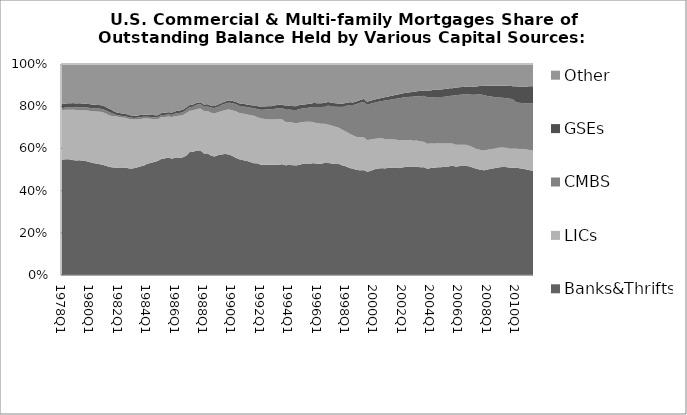
| Category | Banks&Thrifts | LICs | CMBS | GSEs | Other |
|---|---|---|---|---|---|
| 1978Q1 | 0.545 | 0.236 | 0.009 | 0.02 | 0.19 |
| 1978Q2 | 0.549 | 0.235 | 0.011 | 0.019 | 0.187 |
| 1978Q3 | 0.548 | 0.235 | 0.011 | 0.019 | 0.187 |
| 1978Q4 | 0.545 | 0.239 | 0.012 | 0.019 | 0.185 |
| 1979Q1 | 0.543 | 0.239 | 0.013 | 0.019 | 0.187 |
| 1979Q2 | 0.543 | 0.239 | 0.013 | 0.018 | 0.186 |
| 1979Q3 | 0.542 | 0.239 | 0.014 | 0.018 | 0.187 |
| 1979Q4 | 0.539 | 0.241 | 0.014 | 0.018 | 0.189 |
| 1980Q1 | 0.534 | 0.244 | 0.014 | 0.017 | 0.191 |
| 1980Q2 | 0.53 | 0.245 | 0.015 | 0.017 | 0.193 |
| 1980Q3 | 0.527 | 0.247 | 0.015 | 0.017 | 0.194 |
| 1980Q4 | 0.524 | 0.249 | 0.015 | 0.017 | 0.195 |
| 1981Q1 | 0.52 | 0.248 | 0.015 | 0.016 | 0.201 |
| 1981Q2 | 0.514 | 0.246 | 0.015 | 0.016 | 0.21 |
| 1981Q3 | 0.51 | 0.243 | 0.015 | 0.015 | 0.217 |
| 1981Q4 | 0.51 | 0.243 | 0.007 | 0.012 | 0.228 |
| 1982Q1 | 0.507 | 0.242 | 0.007 | 0.012 | 0.232 |
| 1982Q2 | 0.507 | 0.239 | 0.007 | 0.012 | 0.234 |
| 1982Q3 | 0.508 | 0.236 | 0.007 | 0.012 | 0.237 |
| 1982Q4 | 0.505 | 0.234 | 0.007 | 0.011 | 0.242 |
| 1983Q1 | 0.505 | 0.232 | 0.008 | 0.011 | 0.245 |
| 1983Q2 | 0.509 | 0.227 | 0.008 | 0.011 | 0.245 |
| 1983Q3 | 0.514 | 0.225 | 0.009 | 0.01 | 0.242 |
| 1983Q4 | 0.518 | 0.223 | 0.009 | 0.01 | 0.24 |
| 1984Q1 | 0.527 | 0.215 | 0.009 | 0.009 | 0.24 |
| 1984Q2 | 0.531 | 0.209 | 0.008 | 0.01 | 0.241 |
| 1984Q3 | 0.536 | 0.203 | 0.009 | 0.01 | 0.242 |
| 1984Q4 | 0.541 | 0.198 | 0.008 | 0.01 | 0.243 |
| 1985Q1 | 0.55 | 0.198 | 0.01 | 0.01 | 0.232 |
| 1985Q2 | 0.553 | 0.196 | 0.01 | 0.01 | 0.231 |
| 1985Q3 | 0.557 | 0.194 | 0.01 | 0.011 | 0.228 |
| 1985Q4 | 0.551 | 0.197 | 0.01 | 0.011 | 0.23 |
| 1986Q1 | 0.557 | 0.196 | 0.012 | 0.01 | 0.224 |
| 1986Q2 | 0.556 | 0.199 | 0.013 | 0.012 | 0.221 |
| 1986Q3 | 0.557 | 0.2 | 0.014 | 0.012 | 0.217 |
| 1986Q4 | 0.565 | 0.202 | 0.016 | 0.01 | 0.206 |
| 1987Q1 | 0.583 | 0.195 | 0.018 | 0.009 | 0.195 |
| 1987Q2 | 0.584 | 0.196 | 0.019 | 0.009 | 0.191 |
| 1987Q3 | 0.59 | 0.197 | 0.02 | 0.009 | 0.184 |
| 1987Q4 | 0.59 | 0.199 | 0.021 | 0.009 | 0.181 |
| 1988Q1 | 0.576 | 0.201 | 0.022 | 0.009 | 0.192 |
| 1988Q2 | 0.576 | 0.201 | 0.023 | 0.009 | 0.191 |
| 1988Q3 | 0.566 | 0.203 | 0.025 | 0.009 | 0.198 |
| 1988Q4 | 0.561 | 0.204 | 0.026 | 0.009 | 0.199 |
| 1989Q1 | 0.568 | 0.203 | 0.027 | 0.009 | 0.192 |
| 1989Q2 | 0.571 | 0.205 | 0.029 | 0.01 | 0.184 |
| 1989Q3 | 0.574 | 0.208 | 0.031 | 0.01 | 0.177 |
| 1989Q4 | 0.571 | 0.214 | 0.032 | 0.011 | 0.172 |
| 1990Q1 | 0.564 | 0.216 | 0.034 | 0.011 | 0.175 |
| 1990Q2 | 0.555 | 0.22 | 0.034 | 0.011 | 0.18 |
| 1990Q3 | 0.548 | 0.22 | 0.034 | 0.011 | 0.187 |
| 1990Q4 | 0.544 | 0.22 | 0.036 | 0.012 | 0.187 |
| 1991Q1 | 0.541 | 0.221 | 0.035 | 0.012 | 0.192 |
| 1991Q2 | 0.535 | 0.222 | 0.035 | 0.012 | 0.195 |
| 1991Q3 | 0.53 | 0.225 | 0.036 | 0.012 | 0.197 |
| 1991Q4 | 0.529 | 0.219 | 0.039 | 0.013 | 0.2 |
| 1992Q1 | 0.523 | 0.219 | 0.041 | 0.014 | 0.204 |
| 1992Q2 | 0.522 | 0.218 | 0.044 | 0.014 | 0.203 |
| 1992Q3 | 0.522 | 0.216 | 0.047 | 0.014 | 0.2 |
| 1992Q4 | 0.522 | 0.214 | 0.048 | 0.015 | 0.2 |
| 1993Q1 | 0.523 | 0.215 | 0.05 | 0.016 | 0.196 |
| 1993Q2 | 0.523 | 0.216 | 0.053 | 0.016 | 0.193 |
| 1993Q3 | 0.525 | 0.213 | 0.053 | 0.017 | 0.192 |
| 1993Q4 | 0.52 | 0.205 | 0.059 | 0.017 | 0.199 |
| 1994Q1 | 0.521 | 0.204 | 0.059 | 0.018 | 0.198 |
| 1994Q2 | 0.521 | 0.201 | 0.06 | 0.018 | 0.2 |
| 1994Q3 | 0.519 | 0.199 | 0.063 | 0.018 | 0.2 |
| 1994Q4 | 0.523 | 0.199 | 0.065 | 0.019 | 0.194 |
| 1995Q1 | 0.527 | 0.198 | 0.064 | 0.018 | 0.192 |
| 1995Q2 | 0.529 | 0.197 | 0.066 | 0.018 | 0.19 |
| 1995Q3 | 0.528 | 0.198 | 0.068 | 0.018 | 0.188 |
| 1995Q4 | 0.53 | 0.193 | 0.074 | 0.018 | 0.185 |
| 1996Q1 | 0.527 | 0.192 | 0.077 | 0.018 | 0.186 |
| 1996Q2 | 0.527 | 0.189 | 0.079 | 0.018 | 0.186 |
| 1996Q3 | 0.531 | 0.185 | 0.082 | 0.017 | 0.184 |
| 1996Q4 | 0.531 | 0.182 | 0.09 | 0.017 | 0.18 |
| 1997Q1 | 0.528 | 0.179 | 0.092 | 0.016 | 0.184 |
| 1997Q2 | 0.526 | 0.176 | 0.096 | 0.016 | 0.186 |
| 1997Q3 | 0.526 | 0.172 | 0.099 | 0.015 | 0.188 |
| 1997Q4 | 0.519 | 0.168 | 0.11 | 0.014 | 0.188 |
| 1998Q1 | 0.515 | 0.165 | 0.122 | 0.013 | 0.185 |
| 1998Q2 | 0.507 | 0.162 | 0.136 | 0.013 | 0.181 |
| 1998Q3 | 0.504 | 0.158 | 0.143 | 0.013 | 0.182 |
| 1998Q4 | 0.498 | 0.157 | 0.156 | 0.013 | 0.177 |
| 1999Q1 | 0.496 | 0.156 | 0.163 | 0.013 | 0.171 |
| 1999Q2 | 0.497 | 0.156 | 0.167 | 0.014 | 0.165 |
| 1999Q3 | 0.49 | 0.15 | 0.167 | 0.014 | 0.179 |
| 1999Q4 | 0.493 | 0.149 | 0.17 | 0.014 | 0.173 |
| 2000Q1 | 0.501 | 0.144 | 0.171 | 0.015 | 0.169 |
| 2000Q2 | 0.504 | 0.143 | 0.173 | 0.015 | 0.165 |
| 2000Q3 | 0.507 | 0.142 | 0.176 | 0.015 | 0.161 |
| 2000Q4 | 0.505 | 0.139 | 0.182 | 0.016 | 0.157 |
| 2001Q1 | 0.509 | 0.136 | 0.185 | 0.017 | 0.154 |
| 2001Q2 | 0.507 | 0.134 | 0.19 | 0.018 | 0.15 |
| 2001Q3 | 0.51 | 0.132 | 0.193 | 0.018 | 0.146 |
| 2001Q4 | 0.506 | 0.131 | 0.2 | 0.019 | 0.143 |
| 2002Q1 | 0.51 | 0.129 | 0.202 | 0.02 | 0.139 |
| 2002Q2 | 0.512 | 0.127 | 0.203 | 0.021 | 0.137 |
| 2002Q3 | 0.514 | 0.126 | 0.205 | 0.021 | 0.134 |
| 2002Q4 | 0.511 | 0.125 | 0.209 | 0.022 | 0.132 |
| 2003Q1 | 0.513 | 0.124 | 0.21 | 0.024 | 0.129 |
| 2003Q2 | 0.51 | 0.122 | 0.214 | 0.025 | 0.128 |
| 2003Q3 | 0.51 | 0.121 | 0.218 | 0.025 | 0.126 |
| 2003Q4 | 0.503 | 0.118 | 0.22 | 0.033 | 0.125 |
| 2004Q1 | 0.508 | 0.116 | 0.217 | 0.034 | 0.125 |
| 2004Q2 | 0.508 | 0.114 | 0.221 | 0.035 | 0.122 |
| 2004Q3 | 0.511 | 0.113 | 0.219 | 0.036 | 0.121 |
| 2004Q4 | 0.511 | 0.112 | 0.22 | 0.036 | 0.12 |
| 2005Q1 | 0.513 | 0.11 | 0.222 | 0.036 | 0.118 |
| 2005Q2 | 0.515 | 0.108 | 0.226 | 0.036 | 0.116 |
| 2005Q3 | 0.518 | 0.105 | 0.226 | 0.036 | 0.115 |
| 2005Q4 | 0.513 | 0.103 | 0.235 | 0.036 | 0.112 |
| 2006Q1 | 0.516 | 0.101 | 0.237 | 0.036 | 0.11 |
| 2006Q2 | 0.517 | 0.101 | 0.238 | 0.036 | 0.109 |
| 2006Q3 | 0.517 | 0.099 | 0.239 | 0.036 | 0.108 |
| 2006Q4 | 0.514 | 0.097 | 0.244 | 0.036 | 0.109 |
| 2007Q1 | 0.507 | 0.096 | 0.251 | 0.038 | 0.108 |
| 2007Q2 | 0.503 | 0.095 | 0.257 | 0.039 | 0.106 |
| 2007Q3 | 0.498 | 0.094 | 0.264 | 0.04 | 0.104 |
| 2007Q4 | 0.496 | 0.094 | 0.261 | 0.046 | 0.102 |
| 2008Q1 | 0.5 | 0.094 | 0.254 | 0.048 | 0.104 |
| 2008Q2 | 0.504 | 0.094 | 0.248 | 0.051 | 0.104 |
| 2008Q3 | 0.507 | 0.094 | 0.242 | 0.054 | 0.104 |
| 2008Q4 | 0.51 | 0.094 | 0.238 | 0.056 | 0.103 |
| 2009Q1 | 0.512 | 0.093 | 0.236 | 0.057 | 0.103 |
| 2009Q2 | 0.512 | 0.092 | 0.235 | 0.058 | 0.103 |
| 2009Q3 | 0.509 | 0.092 | 0.235 | 0.06 | 0.104 |
| 2009Q4 | 0.508 | 0.092 | 0.233 | 0.061 | 0.105 |
| 2010Q1 | 0.508 | 0.092 | 0.218 | 0.076 | 0.106 |
| 2010Q2 | 0.506 | 0.092 | 0.218 | 0.077 | 0.107 |
| 2010Q3 | 0.503 | 0.094 | 0.218 | 0.079 | 0.107 |
| 2010Q4 | 0.5 | 0.095 | 0.218 | 0.081 | 0.106 |
| 2011Q1 | 0.496 | 0.096 | 0.22 | 0.082 | 0.106 |
| 2011Q2 | 0.492 | 0.098 | 0.223 | 0.082 | 0.106 |